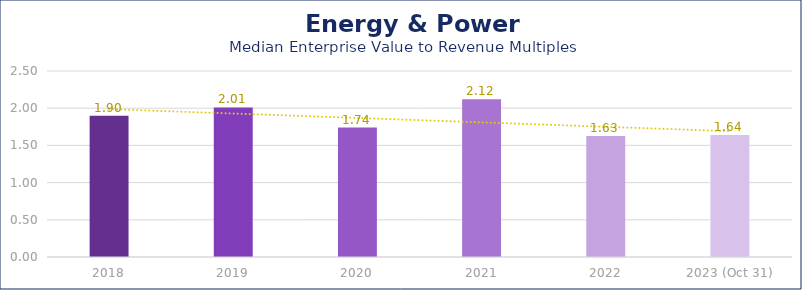
| Category | Energy & Power |
|---|---|
| 2018 | 1.9 |
| 2019 | 2.01 |
| 2020 | 1.74 |
| 2021 | 2.12 |
| 2022 | 1.625 |
| 2023 (Oct 31) | 1.64 |